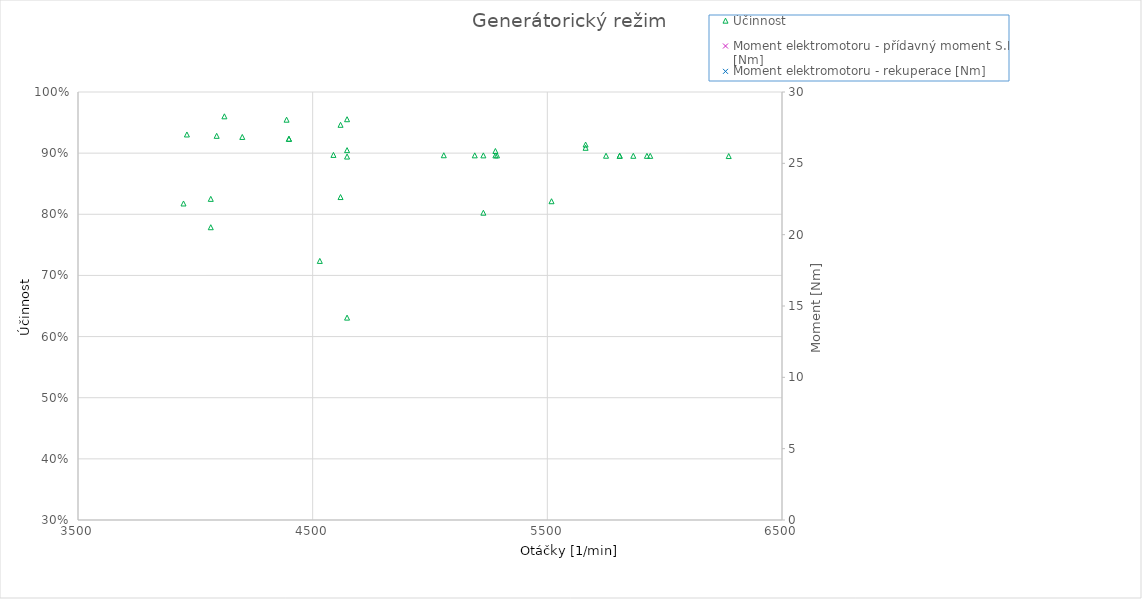
| Category | Účinnost |
|---|---|
| 4646.610642806095 | 0.955 |
| 5663.056720919929 | 0.909 |
| 5663.056720919929 | 0.914 |
| 4588.528009771018 | 0.897 |
| 4123.866945490409 | 0.96 |
| 6272.924367788228 | 0.895 |
| 5866.345936542695 | 0.896 |
| 5938.522149652459 | 0.896 |
| 5924.428569577772 | 0.896 |
| 5750.180670472542 | 0.896 |
| 4200.100401348946 | 0.926 |
| 5278.68635524663 | 0.896 |
| 5058.741090444686 | 0.897 |
| 5808.263303507619 | 0.896 |
| 5808.263303507619 | 0.896 |
| 5190.708249325852 | 0.896 |
| 4090.9819253161386 | 0.928 |
| 4398.905296038858 | 0.923 |
| 4398.905296038858 | 0.923 |
| 3964.139704643949 | 0.931 |
| 5285.519606191933 | 0.896 |
| 5227.436973156857 | 0.896 |
| 3949.619046385181 | 0.818 |
| 4065.784312455333 | 0.779 |
| 4388.868958712945 | 0.955 |
| 4646.610642806095 | 0.631 |
| 4065.784312455333 | 0.825 |
| 4646.610642806095 | 0.894 |
| 4530.445376735944 | 0.724 |
| 5227.436973156857 | 0.803 |
| 5278.686355246629 | 0.904 |
| 4618.8505608408 | 0.828 |
| 4618.850560840801 | 0.946 |
| 5517.850138332237 | 0.821 |
| 4646.610642806095 | 0.905 |